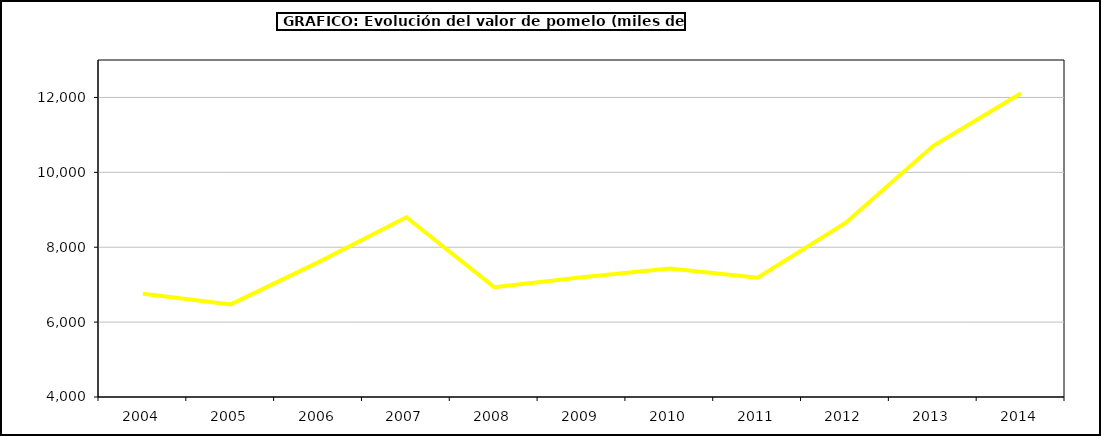
| Category | Valor |
|---|---|
| 2004.0 | 6758.017 |
| 2005.0 | 6473.401 |
| 2006.0 | 7601.593 |
| 2007.0 | 8799.68 |
| 2008.0 | 6934.237 |
| 2009.0 | 7196.478 |
| 2010.0 | 7430.969 |
| 2011.0 | 7186.419 |
| 2012.0 | 8649.711 |
| 2013.0 | 10707.894 |
| 2014.0 | 12111.902 |